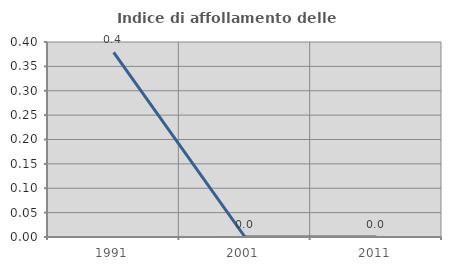
| Category | Indice di affollamento delle abitazioni  |
|---|---|
| 1991.0 | 0.379 |
| 2001.0 | 0 |
| 2011.0 | 0 |